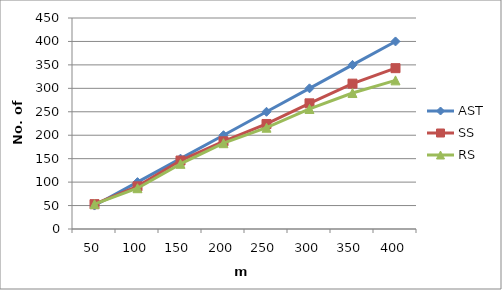
| Category | AST | SS | RS |
|---|---|---|---|
| 50.0 | 50 | 53 | 53 |
| 100.0 | 100 | 91 | 87 |
| 150.0 | 150 | 146 | 139 |
| 200.0 | 200 | 187 | 183 |
| 250.0 | 250 | 224 | 216 |
| 300.0 | 300 | 268 | 256 |
| 350.0 | 350 | 310 | 290 |
| 400.0 | 400 | 343 | 317 |